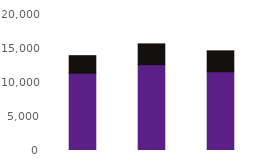
| Category | Online | Telephony |
|---|---|---|
| Sep23 | 11365 | 2579 |
| Oct23 | 12621 | 3057 |
| Nov23 | 11581 | 3073 |